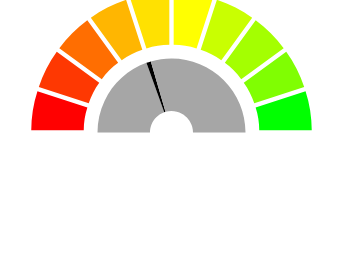
| Category | Series 0 | Series 1 |
|---|---|---|
| 0 | 39 | 10 |
| 1 | 0 | 10 |
| 2 | 2 | 10 |
| 3 | 59 | 10 |
| 4 | 0 | 10 |
| 5 | 0 | 10 |
| 6 | 0 | 10 |
| 7 | 0 | 10 |
| 8 | 0 | 10 |
| 9 | 0 | 10 |
| 10 | 100 | 100 |